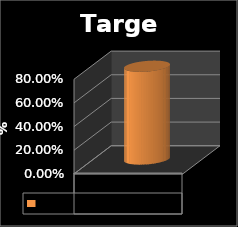
| Category | Ratio |
|---|---|
| 0 | 0.784 |